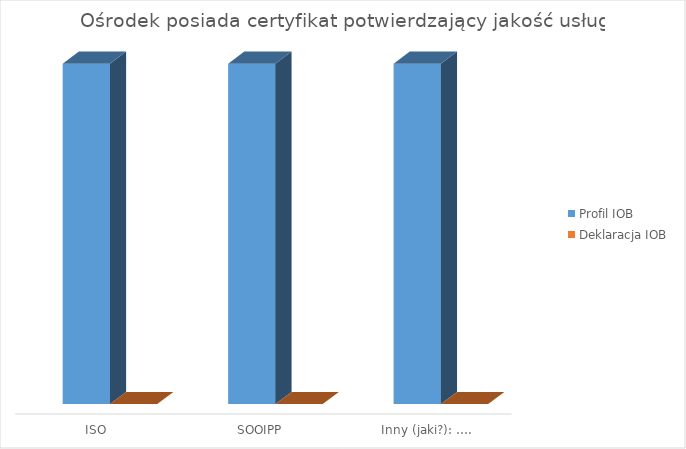
| Category | Profil IOB | Deklaracja IOB |
|---|---|---|
| ISO | 1 | 0 |
| SOOIPP  | 1 | 0 |
| Inny (jaki?): …. | 1 | 0 |